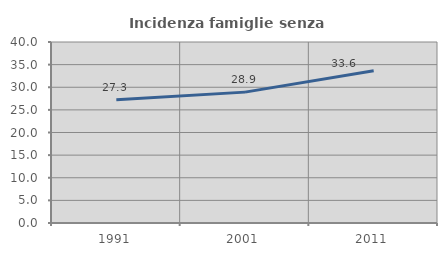
| Category | Incidenza famiglie senza nuclei |
|---|---|
| 1991.0 | 27.255 |
| 2001.0 | 28.923 |
| 2011.0 | 33.638 |